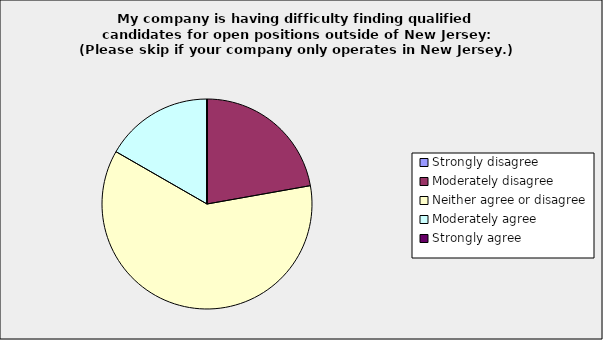
| Category | Series 0 |
|---|---|
| Strongly disagree | 0 |
| Moderately disagree | 0.222 |
| Neither agree or disagree | 0.611 |
| Moderately agree | 0.167 |
| Strongly agree | 0 |